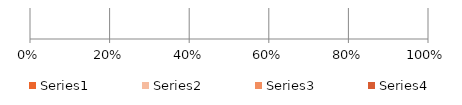
| Category | Series 0 | Series 1 | Series 2 | Series 3 |
|---|---|---|---|---|
| 0 | 13375.898 | 5138.633 | 1607.29 | 426.432 |